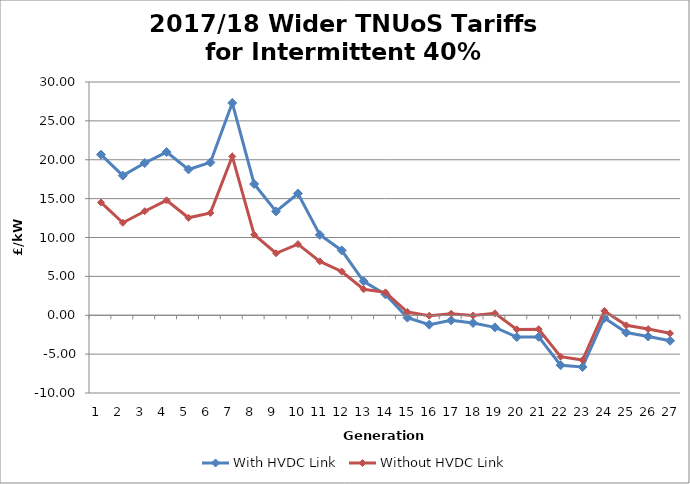
| Category | With HVDC Link | Without HVDC Link |
|---|---|---|
| 1.0 | 20.659 | 14.509 |
| 2.0 | 17.962 | 11.894 |
| 3.0 | 19.58 | 13.381 |
| 4.0 | 20.984 | 14.781 |
| 5.0 | 18.749 | 12.537 |
| 6.0 | 19.658 | 13.162 |
| 7.0 | 27.307 | 20.423 |
| 8.0 | 16.881 | 10.361 |
| 9.0 | 13.357 | 7.973 |
| 10.0 | 15.656 | 9.142 |
| 11.0 | 10.342 | 6.932 |
| 12.0 | 8.339 | 5.628 |
| 13.0 | 4.372 | 3.342 |
| 14.0 | 2.68 | 2.944 |
| 15.0 | -0.307 | 0.419 |
| 16.0 | -1.208 | -0.061 |
| 17.0 | -0.658 | 0.2 |
| 18.0 | -0.995 | -0.033 |
| 19.0 | -1.557 | 0.249 |
| 20.0 | -2.811 | -1.818 |
| 21.0 | -2.787 | -1.8 |
| 22.0 | -6.423 | -5.332 |
| 23.0 | -6.656 | -5.756 |
| 24.0 | -0.348 | 0.559 |
| 25.0 | -2.228 | -1.295 |
| 26.0 | -2.735 | -1.781 |
| 27.0 | -3.282 | -2.323 |